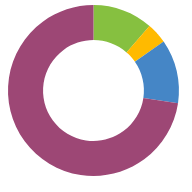
| Category | ACTIVE |
|---|---|
| NUMERAR | 43300 |
| INVESTIȚII | 15000 |
| PENSIE | 46000 |
| PERSONAL | 276500 |